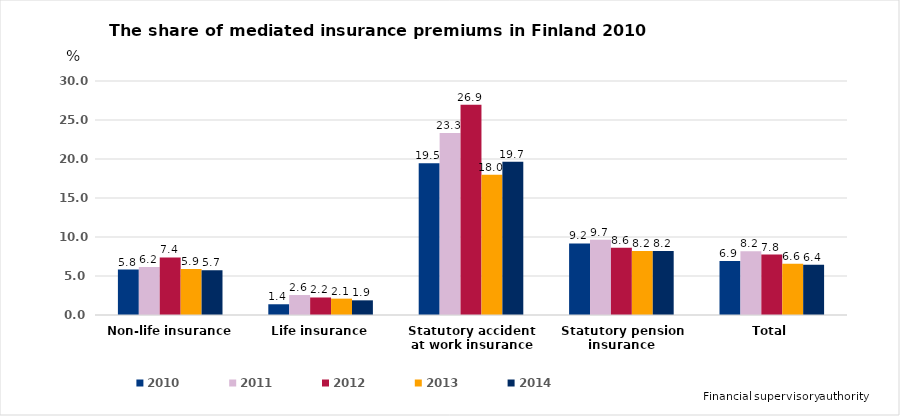
| Category | 2010 | 2011 | 2012 | 2013 | 2014 |
|---|---|---|---|---|---|
| Non-life insurance | 5.826 | 6.168 | 7.375 | 5.882 | 5.737 |
| Life insurance | 1.376 | 2.56 | 2.246 | 2.097 | 1.88 |
| Statutory accident at work insurance | 19.457 | 23.324 | 26.944 | 17.98 | 19.654 |
| Statutory pension insurance | 9.174 | 9.661 | 8.637 | 8.204 | 8.203 |
| Total | 6.932 | 8.167 | 7.754 | 6.584 | 6.436 |